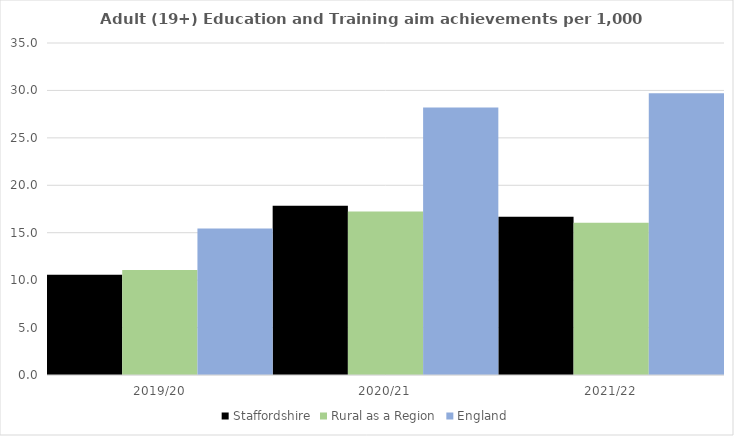
| Category | Staffordshire | Rural as a Region | England |
|---|---|---|---|
| 2019/20 | 10.57 | 11.081 | 15.446 |
| 2020/21 | 17.854 | 17.224 | 28.211 |
| 2021/22 | 16.688 | 16.063 | 29.711 |